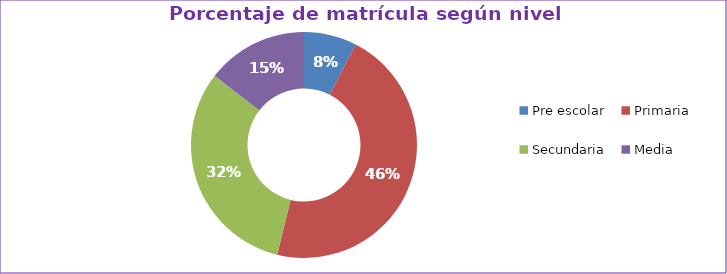
| Category | Series 0 |
|---|---|
| Pre escolar | 0.076 |
| Primaria | 0.463 |
| Secundaria | 0.317 |
| Media | 0.145 |